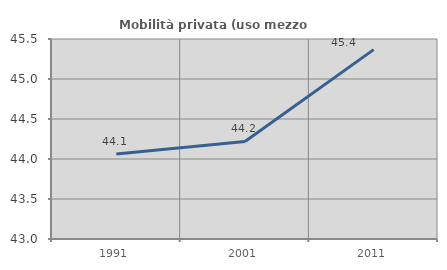
| Category | Mobilità privata (uso mezzo privato) |
|---|---|
| 1991.0 | 44.064 |
| 2001.0 | 44.22 |
| 2011.0 | 45.367 |